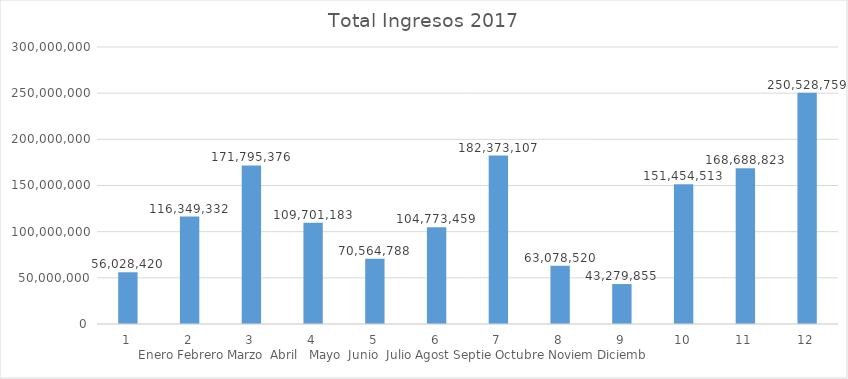
| Category | Series 0 |
|---|---|
| 0 | 56028420 |
| 1 | 116349332 |
| 2 | 171795376 |
| 3 | 109701183 |
| 4 | 70564788 |
| 5 | 104773459 |
| 6 | 182373107 |
| 7 | 63078520 |
| 8 | 43279855 |
| 9 | 151454513 |
| 10 | 168688823 |
| 11 | 250528759 |